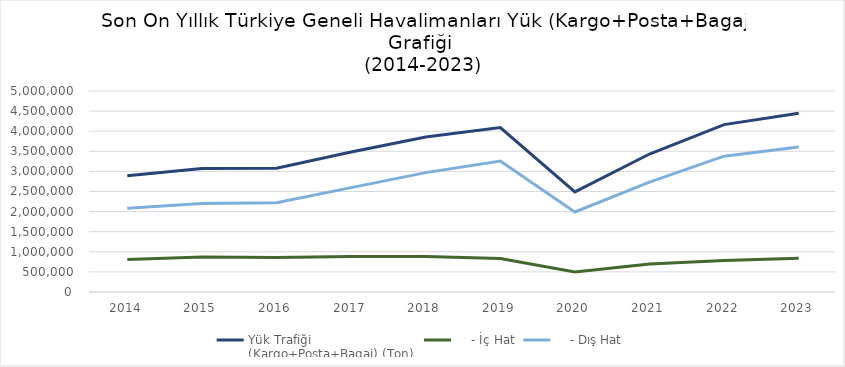
| Category | Yük Trafiği
(Kargo+Posta+Bagaj) (Ton) |     - İç Hat |     - Dış Hat |
|---|---|---|---|
| 2014.0 | 2893000.13 | 810858 | 2082142.13 |
| 2015.0 | 3072831 | 871327 | 2201504 |
| 2016.0 | 3076913.699 | 857335.195 | 2219578.504 |
| 2017.0 | 3481210.565 | 884810.799 | 2596399.766 |
| 2018.0 | 3855230.638 | 886024.804 | 2969205.834 |
| 2019.0 | 4090167.807 | 833768.473 | 3256399.334 |
| 2020.0 | 2490521.167 | 500551.22 | 1989969.947 |
| 2021.0 | 3432517.384 | 698343.83 | 2734173.554 |
| 2022.0 | 4163141.562 | 784022.04 | 3379119.522 |
| 2023.0 | 4447864.917 | 838756.868 | 3609108.049 |